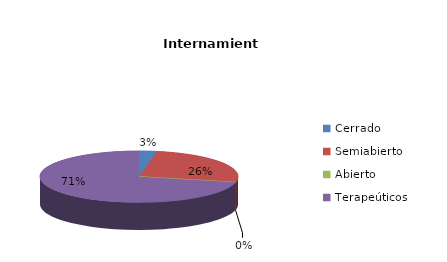
| Category | Series 0 |
|---|---|
| Cerrado | 1 |
| Semiabierto | 9 |
| Abierto | 0 |
| Terapeúticos | 25 |